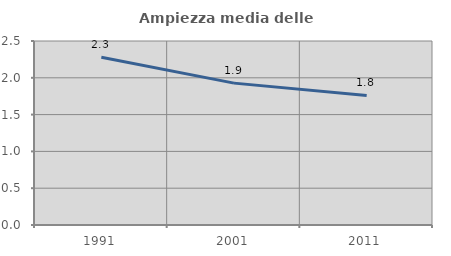
| Category | Ampiezza media delle famiglie |
|---|---|
| 1991.0 | 2.278 |
| 2001.0 | 1.928 |
| 2011.0 | 1.76 |